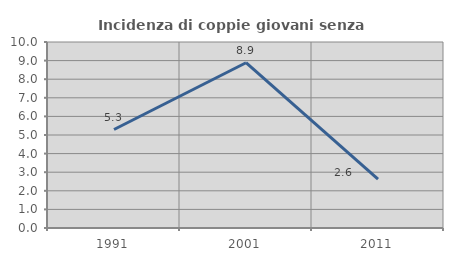
| Category | Incidenza di coppie giovani senza figli |
|---|---|
| 1991.0 | 5.295 |
| 2001.0 | 8.885 |
| 2011.0 | 2.632 |